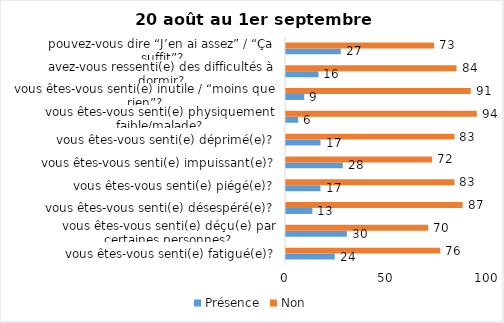
| Category | Présence | Non |
|---|---|---|
| vous êtes-vous senti(e) fatigué(e)? | 24 | 76 |
| vous êtes-vous senti(e) déçu(e) par certaines personnes? | 30 | 70 |
| vous êtes-vous senti(e) désespéré(e)? | 13 | 87 |
| vous êtes-vous senti(e) piégé(e)? | 17 | 83 |
| vous êtes-vous senti(e) impuissant(e)? | 28 | 72 |
| vous êtes-vous senti(e) déprimé(e)? | 17 | 83 |
| vous êtes-vous senti(e) physiquement faible/malade? | 6 | 94 |
| vous êtes-vous senti(e) inutile / “moins que rien”? | 9 | 91 |
| avez-vous ressenti(e) des difficultés à dormir? | 16 | 84 |
| pouvez-vous dire “J’en ai assez” / “Ça suffit”? | 27 | 73 |